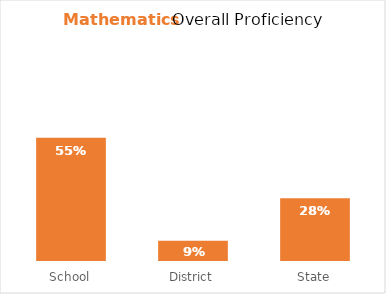
| Category | Mathematics |
|---|---|
| School | 0.55 |
| District | 0.09 |
| State | 0.28 |